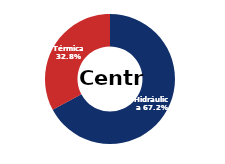
| Category | Centro |
|---|---|
| Eólica | 0 |
| Hidráulica | 2595.365 |
| Solar | 0 |
| Térmica | 1268.419 |